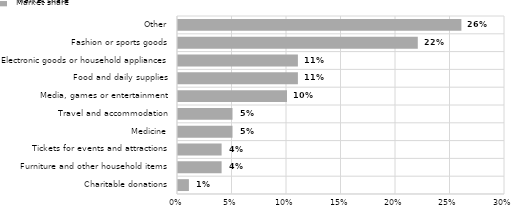
| Category | Market share |
|---|---|
| Charitable donations | 0.01 |
| Furniture and other household items | 0.04 |
| Tickets for events and attractions | 0.04 |
| Medicine | 0.05 |
| Travel and accommodation | 0.05 |
| Media, games or entertainment | 0.1 |
| Food and daily supplies | 0.11 |
| Electronic goods or household appliances | 0.11 |
| Fashion or sports goods | 0.22 |
| Other | 0.26 |